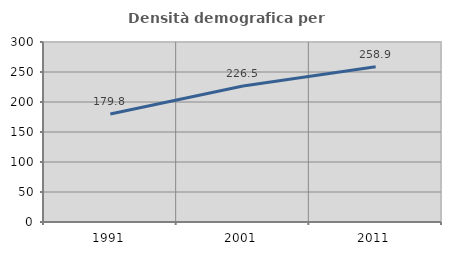
| Category | Densità demografica |
|---|---|
| 1991.0 | 179.85 |
| 2001.0 | 226.536 |
| 2011.0 | 258.874 |